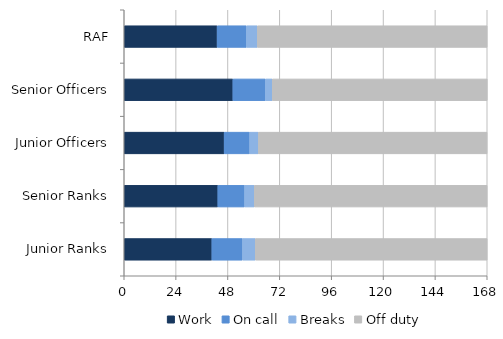
| Category | Work | On call | Breaks | Off duty |
|---|---|---|---|---|
| RAF | 42.993 | 13.531 | 5.086 | 106.375 |
| Senior Officers | 50.294 | 14.965 | 3.26 | 99.505 |
| Junior Officers | 46.252 | 11.786 | 4.098 | 105.814 |
| Senior Ranks | 43.331 | 12.365 | 4.557 | 107.737 |
| Junior Ranks | 40.571 | 14.163 | 5.951 | 107.297 |